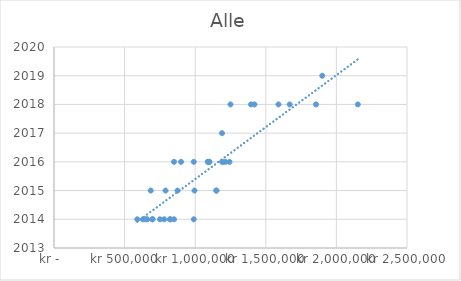
| Category | Årsmodell |
|---|---|
| 695000.0 | 2014 |
| 1420000.0 | 2018 |
| 660000.0 | 2014 |
| 1669000.0 | 2018 |
| 1856000.0 | 2018 |
| 1243000.0 | 2016 |
| 1250000.0 | 2018 |
| 1590000.0 | 2018 |
| 1150000.0 | 2015 |
| 1100000.0 | 2016 |
| 1100000.0 | 2016 |
| 790000.0 | 2015 |
| 995000.0 | 2015 |
| 825000.0 | 2014 |
| 1090000.0 | 2016 |
| 850000.0 | 2016 |
| 590000.0 | 2014 |
| 990000.0 | 2014 |
| 2152000.0 | 2018 |
| 850000.0 | 2014 |
| 820000.0 | 2014 |
| 780000.0 | 2014 |
| 750000.0 | 2014 |
| 699000.0 | 2014 |
| 650000.0 | 2014 |
| 630000.0 | 2014 |
| 685000.0 | 2015 |
| 1150000.0 | 2015 |
| 875000.0 | 2015 |
| 900000.0 | 2016 |
| 1090000.0 | 2016 |
| 1215000.0 | 2016 |
| 1190000.0 | 2016 |
| 990000.0 | 2016 |
| 1200000.0 | 2016 |
| 1190000.0 | 2017 |
| 1395000.0 | 2018 |
| 1900000.0 | 2019 |